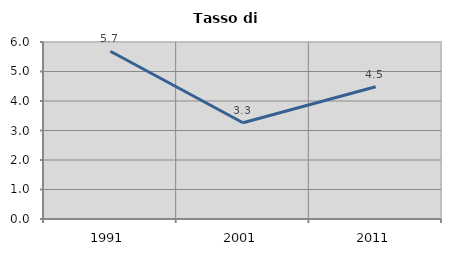
| Category | Tasso di disoccupazione   |
|---|---|
| 1991.0 | 5.687 |
| 2001.0 | 3.263 |
| 2011.0 | 4.483 |